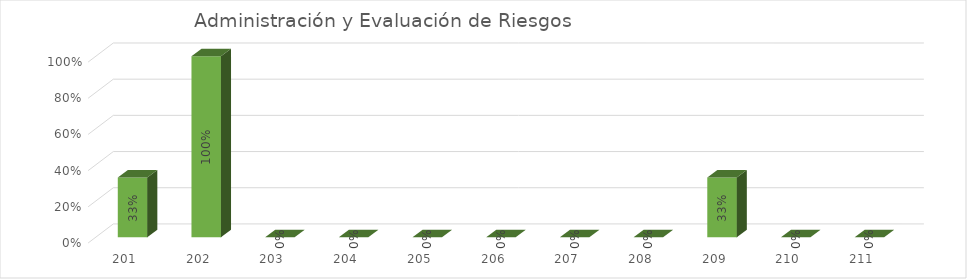
| Category | % Avance semestral |
|---|---|
| 201.0 | 0.33 |
| 202.0 | 1 |
| 203.0 | 0 |
| 204.0 | 0 |
| 205.0 | 0 |
| 206.0 | 0 |
| 207.0 | 0 |
| 208.0 | 0 |
| 209.0 | 0.33 |
| 210.0 | 0 |
| 211.0 | 0 |